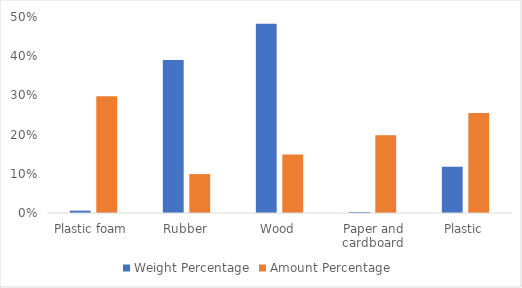
| Category | Weight Percentage | Amount Percentage  |
|---|---|---|
| Plastic foam | 0.006 | 0.298 |
| Rubber | 0.39 | 0.099 |
| Wood | 0.483 | 0.149 |
| Paper and cardboard | 0.003 | 0.199 |
| Plastic | 0.118 | 0.255 |